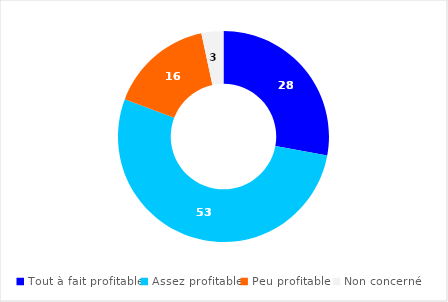
| Category | Series 0 |
|---|---|
| Tout à fait profitable | 27.9 |
| Assez profitable | 52.86 |
| Peu profitable  | 15.87 |
| Non concerné | 3.37 |